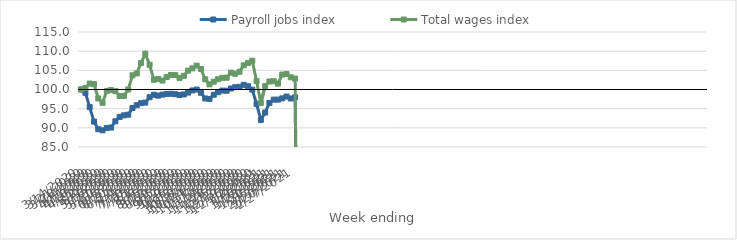
| Category | Payroll jobs index | Total wages index |
|---|---|---|
| 14/03/2020 | 100 | 100 |
| 21/03/2020 | 99.131 | 100.395 |
| 28/03/2020 | 95.407 | 101.55 |
| 04/04/2020 | 91.622 | 101.395 |
| 11/04/2020 | 89.64 | 97.673 |
| 18/04/2020 | 89.352 | 96.534 |
| 25/04/2020 | 89.974 | 99.639 |
| 02/05/2020 | 90.079 | 99.843 |
| 09/05/2020 | 91.708 | 99.569 |
| 16/05/2020 | 92.838 | 98.297 |
| 23/05/2020 | 93.259 | 98.316 |
| 30/05/2020 | 93.435 | 99.996 |
| 06/06/2020 | 95.178 | 103.703 |
| 13/06/2020 | 95.899 | 104.19 |
| 20/06/2020 | 96.431 | 106.934 |
| 27/06/2020 | 96.582 | 109.336 |
| 04/07/2020 | 97.987 | 106.448 |
| 11/07/2020 | 98.631 | 102.529 |
| 18/07/2020 | 98.403 | 102.754 |
| 25/07/2020 | 98.666 | 102.329 |
| 01/08/2020 | 98.848 | 103.269 |
| 08/08/2020 | 98.884 | 103.781 |
| 15/08/2020 | 98.772 | 103.765 |
| 22/08/2020 | 98.563 | 103.036 |
| 29/08/2020 | 98.714 | 103.57 |
| 05/09/2020 | 99.198 | 104.918 |
| 12/09/2020 | 99.743 | 105.516 |
| 19/09/2020 | 99.984 | 106.23 |
| 26/09/2020 | 99.162 | 105.332 |
| 03/10/2020 | 97.66 | 102.657 |
| 10/10/2020 | 97.542 | 101.342 |
| 17/10/2020 | 98.639 | 102.037 |
| 24/10/2020 | 99.292 | 102.671 |
| 31/10/2020 | 99.715 | 103.04 |
| 07/11/2020 | 99.686 | 103.079 |
| 14/11/2020 | 100.264 | 104.4 |
| 21/11/2020 | 100.602 | 104.106 |
| 28/11/2020 | 100.699 | 104.621 |
| 05/12/2020 | 101.225 | 106.311 |
| 12/12/2020 | 100.852 | 106.92 |
| 19/12/2020 | 99.96 | 107.512 |
| 26/12/2020 | 96.191 | 102.178 |
| 02/01/2021 | 92.078 | 96.501 |
| 09/01/2021 | 93.988 | 100.879 |
| 16/01/2021 | 96.502 | 102.095 |
| 23/01/2021 | 97.356 | 102.16 |
| 30/01/2021 | 97.359 | 101.523 |
| 06/02/2021 | 97.692 | 103.891 |
| 13/02/2021 | 98.158 | 104.045 |
| 20/02/2021 | 97.66 | 103.184 |
| 27/02/2021 | 97.95 | 102.854 |